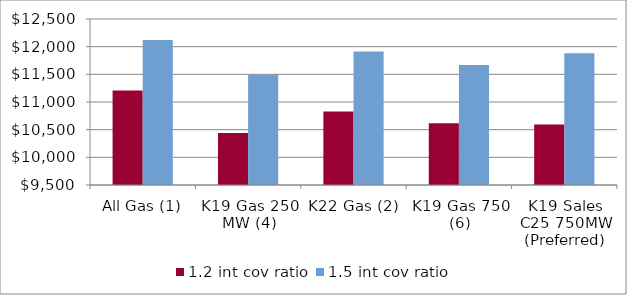
| Category | 1.2 int cov ratio | 1.5 int cov ratio |
|---|---|---|
| All Gas (1) | 11206.505 | 12118.388 |
| K19 Gas 250 MW (4) | 10441.391 | 11493.56 |
| K22 Gas (2) | 10827.152 | 11914.372 |
| K19 Gas 750 (6) | 10617.184 | 11666.547 |
| K19 Sales C25 750MW (Preferred) | 10594.501 | 11880.954 |